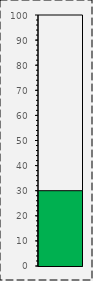
| Category | Target |
|---|---|
| 0 | 100 |